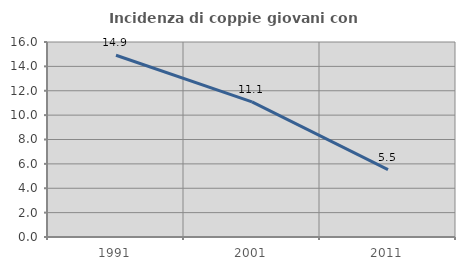
| Category | Incidenza di coppie giovani con figli |
|---|---|
| 1991.0 | 14.911 |
| 2001.0 | 11.093 |
| 2011.0 | 5.528 |